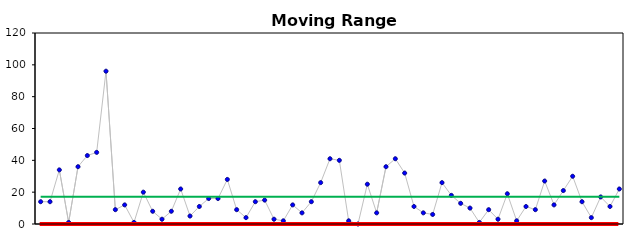
| Category | MR | UCL | LCL | Mean |
|---|---|---|---|---|
| 0 | 35 | 62.125 | 0 | 19.016 |
| 1 | 35 | 62.125 | 0 | 19.016 |
| 2 | 36 | 62.125 | 0 | 19.016 |
| 3 | 1 | 62.125 | 0 | 19.016 |
| 4 | 12 | 62.125 | 0 | 19.016 |
| 5 | 75 | 62.125 | 0 | 19.016 |
| 6 | 45 | 62.125 | 0 | 19.016 |
| 7 | 126 | 62.125 | 0 | 19.016 |
| 8 | 17 | 62.125 | 0 | 19.016 |
| 9 | 2 | 62.125 | 0 | 19.016 |
| 10 | 3 | 62.125 | 0 | 19.016 |
| 11 | 24 | 62.125 | 0 | 19.016 |
| 12 | 23 | 62.125 | 0 | 19.016 |
| 13 | 2 | 62.125 | 0 | 19.016 |
| 14 | 23 | 62.125 | 0 | 19.016 |
| 15 | 15 | 62.125 | 0 | 19.016 |
| 16 | 17 | 62.125 | 0 | 19.016 |
| 17 | 16 | 62.125 | 0 | 19.016 |
| 18 | 15 | 62.125 | 0 | 19.016 |
| 19 | 4 | 62.125 | 0 | 19.016 |
| 20 | 34 | 62.125 | 0 | 19.016 |
| 21 | 4 | 62.125 | 0 | 19.016 |
| 22 | 0 | 62.125 | 0 | 19.016 |
| 23 | 21 | 62.125 | 0 | 19.016 |
| 24 | 20 | 62.125 | 0 | 19.016 |
| 25 | 25 | 62.125 | 0 | 19.016 |
| 26 | 30 | 62.125 | 0 | 19.016 |
| 27 | 42 | 62.125 | 0 | 19.016 |
| 28 | 26 | 62.125 | 0 | 19.016 |
| 29 | 13 | 62.125 | 0 | 19.016 |
| 30 | 24 | 62.125 | 0 | 19.016 |
| 31 | 24 | 62.125 | 0 | 19.016 |
| 32 | 12 | 62.125 | 0 | 19.016 |
| 33 | 29 | 62.125 | 0 | 19.016 |
| 34 | 22 | 62.125 | 0 | 19.016 |
| 35 | 7 | 62.125 | 0 | 19.016 |
| 36 | 5 | 62.125 | 0 | 19.016 |
| 37 | 8 | 62.125 | 0 | 19.016 |
| 38 | 13 | 62.125 | 0 | 19.016 |
| 39 | 0 | 62.125 | 0 | 19.016 |
| 40 | 34 | 62.125 | 0 | 19.016 |
| 41 | 35 | 62.125 | 0 | 19.016 |
| 42 | 31 | 62.125 | 0 | 19.016 |
| 43 | 13 | 62.125 | 0 | 19.016 |
| 44 | 24 | 62.125 | 0 | 19.016 |
| 45 | 1 | 62.125 | 0 | 19.016 |
| 46 | 4 | 62.125 | 0 | 19.016 |
| 47 | 6 | 62.125 | 0 | 19.016 |
| 48 | 2 | 62.125 | 0 | 19.016 |
| 49 | 10 | 62.125 | 0 | 19.016 |
| 50 | 42 | 62.125 | 0 | 19.016 |
| 51 | 21 | 62.125 | 0 | 19.016 |
| 52 | 1 | 62.125 | 0 | 19.016 |
| 53 | 9 | 62.125 | 0 | 19.016 |
| 54 | 0 | 62.125 | 0 | 19.016 |
| 55 | 6 | 62.125 | 0 | 19.016 |
| 56 | 23 | 62.125 | 0 | 19.016 |
| 57 | 7 | 62.125 | 0 | 19.016 |
| 58 | 9 | 62.125 | 0 | 19.016 |
| 59 | 1 | 62.125 | 0 | 19.016 |
| 60 | 3 | 62.125 | 0 | 19.016 |
| 61 | 26 | 62.125 | 0 | 19.016 |
| 62 | 5 | 62.125 | 0 | 19.016 |